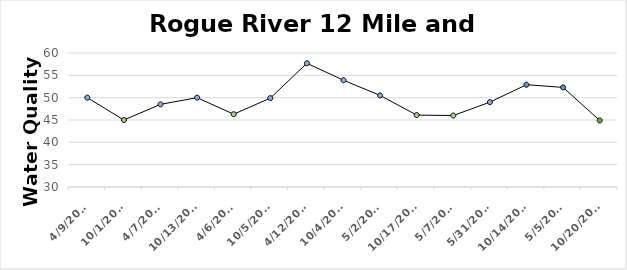
| Category | Series 0 |
|---|---|
| 4/9/11 | 50 |
| 10/1/11 | 45 |
| 4/7/12 | 48.5 |
| 10/13/12 | 50 |
| 4/6/13 | 46.3 |
| 10/5/13 | 49.9 |
| 4/12/14 | 57.7 |
| 10/4/14 | 53.9 |
| 5/2/15 | 50.5 |
| 10/17/15 | 46.1 |
| 5/7/16 | 46 |
| 5/31/17 | 49 |
| 10/14/17 | 52.9 |
| 5/5/18 | 52.3 |
| 10/20/18 | 44.9 |